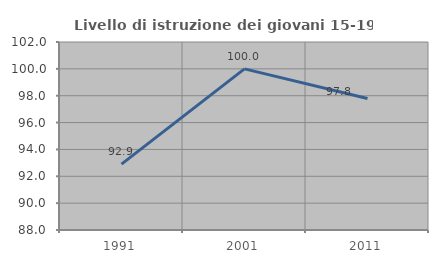
| Category | Livello di istruzione dei giovani 15-19 anni |
|---|---|
| 1991.0 | 92.903 |
| 2001.0 | 100 |
| 2011.0 | 97.794 |